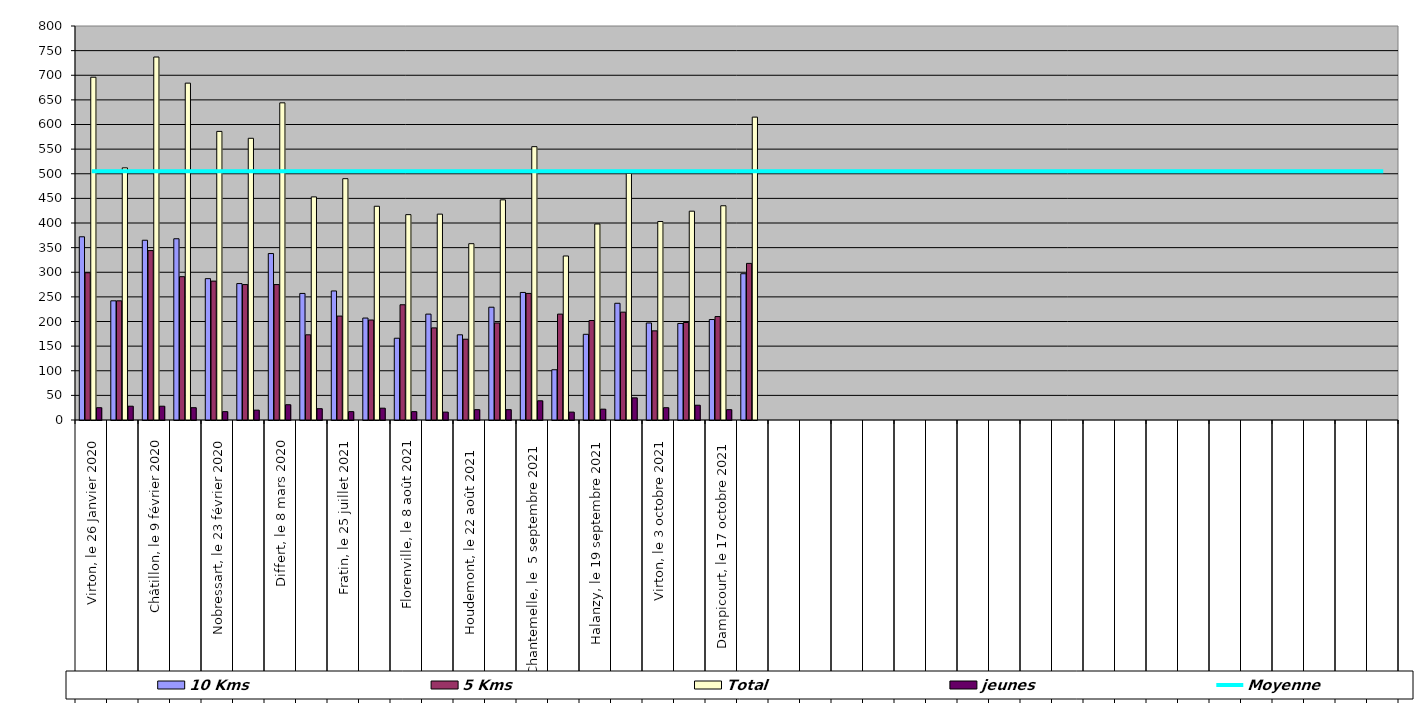
| Category | 10 Kms | 5 Kms | Total | jeunes |
|---|---|---|---|---|
| 0 | 372 | 299 | 696 | 25 |
| 1 | 242 | 242 | 512 | 28 |
| 2 | 365 | 344 | 737 | 28 |
| 3 | 368 | 291 | 684 | 25 |
| 4 | 287 | 282 | 586 | 17 |
| 5 | 277 | 275 | 572 | 20 |
| 6 | 338 | 275 | 644 | 31 |
| 7 | 257 | 173 | 453 | 23 |
| 8 | 262 | 211 | 490 | 17 |
| 9 | 207 | 203 | 434 | 24 |
| 10 | 166 | 234 | 417 | 17 |
| 11 | 215 | 187 | 418 | 16 |
| 12 | 173 | 164 | 358 | 21 |
| 13 | 229 | 197 | 447 | 21 |
| 14 | 259 | 257 | 555 | 39 |
| 15 | 102 | 215 | 333 | 16 |
| 16 | 174 | 202 | 398 | 22 |
| 17 | 237 | 219 | 501 | 45 |
| 18 | 197 | 181 | 403 | 25 |
| 19 | 196 | 198 | 424 | 30 |
| 20 | 204 | 210 | 435 | 21 |
| 21 | 297 | 318 | 615 | 0 |
| 22 | 0 | 0 | 0 | 0 |
| 23 | 0 | 0 | 0 | 0 |
| 24 | 0 | 0 | 0 | 0 |
| 25 | 0 | 0 | 0 | 0 |
| 26 | 0 | 0 | 0 | 0 |
| 27 | 0 | 0 | 0 | 0 |
| 28 | 0 | 0 | 0 | 0 |
| 29 | 0 | 0 | 0 | 0 |
| 30 | 0 | 0 | 0 | 0 |
| 31 | 0 | 0 | 0 | 0 |
| 32 | 0 | 0 | 0 | 0 |
| 33 | 0 | 0 | 0 | 0 |
| 34 | 0 | 0 | 0 | 0 |
| 35 | 0 | 0 | 0 | 0 |
| 36 | 0 | 0 | 0 | 0 |
| 37 | 0 | 0 | 0 | 0 |
| 38 | 0 | 0 | 0 | 0 |
| 39 | 0 | 0 | 0 | 0 |
| 40 | 0 | 0 | 0 | 0 |
| 41 | 0 | 0 | 0 | 0 |